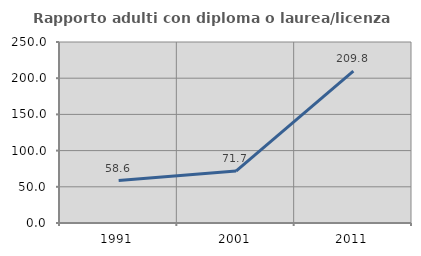
| Category | Rapporto adulti con diploma o laurea/licenza media  |
|---|---|
| 1991.0 | 58.643 |
| 2001.0 | 71.732 |
| 2011.0 | 209.809 |